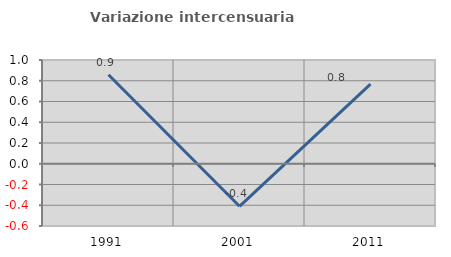
| Category | Variazione intercensuaria annua |
|---|---|
| 1991.0 | 0.858 |
| 2001.0 | -0.41 |
| 2011.0 | 0.767 |